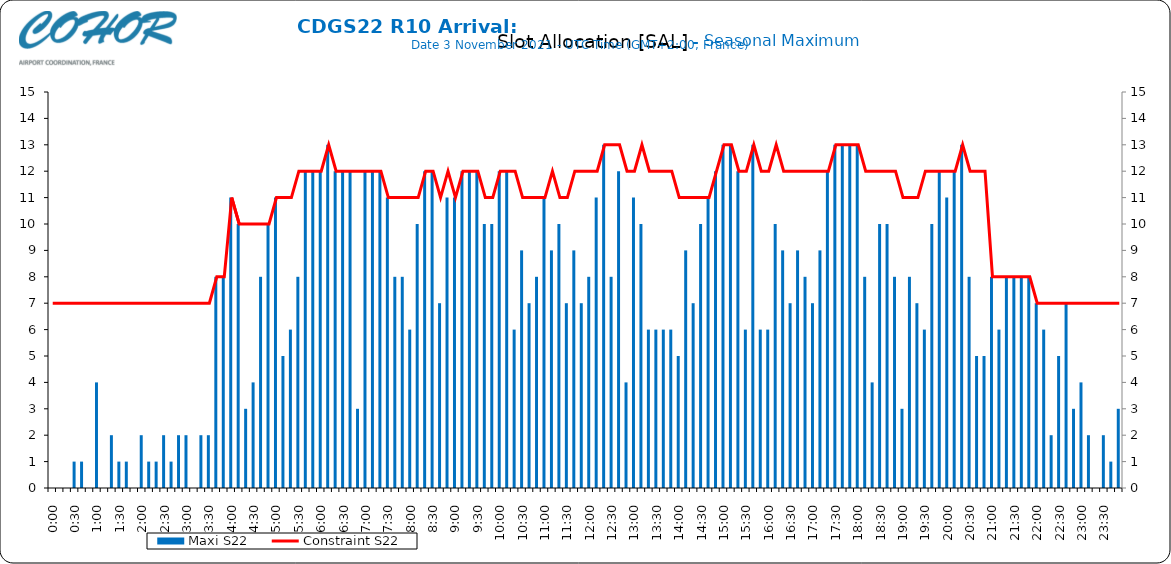
| Category | Maxi S22 |
|---|---|
| 0.0 | 0 |
| 0.006944444444444444 | 0 |
| 0.013888888888888888 | 0 |
| 0.020833333333333332 | 1 |
| 0.027777777777777776 | 1 |
| 0.034722222222222224 | 0 |
| 0.041666666666666664 | 4 |
| 0.04861111111111111 | 0 |
| 0.05555555555555555 | 2 |
| 0.0625 | 1 |
| 0.06944444444444443 | 1 |
| 0.0763888888888889 | 0 |
| 0.08333333333333333 | 2 |
| 0.09027777777777778 | 1 |
| 0.09722222222222222 | 1 |
| 0.10416666666666667 | 2 |
| 0.1111111111111111 | 1 |
| 0.11805555555555557 | 2 |
| 0.125 | 2 |
| 0.13194444444444445 | 0 |
| 0.1388888888888889 | 2 |
| 0.14583333333333334 | 2 |
| 0.15277777777777776 | 8 |
| 0.15972222222222224 | 8 |
| 0.16666666666666666 | 11 |
| 0.17361111111111113 | 10 |
| 0.18055555555555555 | 3 |
| 0.1875 | 4 |
| 0.19444444444444445 | 8 |
| 0.20138888888888887 | 10 |
| 0.20833333333333334 | 11 |
| 0.2152777777777778 | 5 |
| 0.2222222222222222 | 6 |
| 0.22916666666666666 | 8 |
| 0.23611111111111113 | 12 |
| 0.24305555555555555 | 12 |
| 0.25 | 12 |
| 0.2569444444444445 | 13 |
| 0.2638888888888889 | 12 |
| 0.2708333333333333 | 12 |
| 0.2777777777777778 | 12 |
| 0.2847222222222222 | 3 |
| 0.2916666666666667 | 12 |
| 0.2986111111111111 | 12 |
| 0.3055555555555555 | 12 |
| 0.3125 | 11 |
| 0.3194444444444445 | 8 |
| 0.3263888888888889 | 8 |
| 0.3333333333333333 | 6 |
| 0.34027777777777773 | 10 |
| 0.34722222222222227 | 12 |
| 0.3541666666666667 | 12 |
| 0.3611111111111111 | 7 |
| 0.3680555555555556 | 11 |
| 0.375 | 11 |
| 0.3819444444444444 | 12 |
| 0.3888888888888889 | 12 |
| 0.3958333333333333 | 12 |
| 0.40277777777777773 | 10 |
| 0.40972222222222227 | 10 |
| 0.4166666666666667 | 12 |
| 0.4236111111111111 | 12 |
| 0.4305555555555556 | 6 |
| 0.4375 | 9 |
| 0.4444444444444444 | 7 |
| 0.4513888888888889 | 8 |
| 0.4583333333333333 | 11 |
| 0.46527777777777773 | 9 |
| 0.47222222222222227 | 10 |
| 0.4791666666666667 | 7 |
| 0.4861111111111111 | 9 |
| 0.4930555555555556 | 7 |
| 0.5 | 8 |
| 0.5069444444444444 | 11 |
| 0.513888888888889 | 13 |
| 0.5208333333333334 | 8 |
| 0.5277777777777778 | 12 |
| 0.5347222222222222 | 4 |
| 0.5416666666666666 | 11 |
| 0.548611111111111 | 10 |
| 0.5555555555555556 | 6 |
| 0.5625 | 6 |
| 0.5694444444444444 | 6 |
| 0.576388888888889 | 6 |
| 0.5833333333333334 | 5 |
| 0.5902777777777778 | 9 |
| 0.5972222222222222 | 7 |
| 0.6041666666666666 | 10 |
| 0.611111111111111 | 11 |
| 0.6180555555555556 | 12 |
| 0.625 | 13 |
| 0.6319444444444444 | 13 |
| 0.638888888888889 | 12 |
| 0.6458333333333334 | 6 |
| 0.6527777777777778 | 13 |
| 0.6597222222222222 | 6 |
| 0.6666666666666666 | 6 |
| 0.6736111111111112 | 10 |
| 0.6805555555555555 | 9 |
| 0.6875 | 7 |
| 0.6944444444444445 | 9 |
| 0.7013888888888888 | 8 |
| 0.7083333333333334 | 7 |
| 0.7152777777777778 | 9 |
| 0.7222222222222222 | 12 |
| 0.7291666666666666 | 13 |
| 0.7361111111111112 | 13 |
| 0.7430555555555555 | 13 |
| 0.75 | 13 |
| 0.7569444444444445 | 8 |
| 0.7638888888888888 | 4 |
| 0.7708333333333334 | 10 |
| 0.7777777777777778 | 10 |
| 0.7847222222222222 | 8 |
| 0.7916666666666666 | 3 |
| 0.7986111111111112 | 8 |
| 0.8055555555555555 | 7 |
| 0.8125 | 6 |
| 0.8194444444444445 | 10 |
| 0.8263888888888888 | 12 |
| 0.8333333333333334 | 11 |
| 0.8402777777777778 | 12 |
| 0.8472222222222222 | 13 |
| 0.8541666666666666 | 8 |
| 0.8611111111111112 | 5 |
| 0.8680555555555555 | 5 |
| 0.875 | 8 |
| 0.8819444444444445 | 6 |
| 0.8888888888888888 | 8 |
| 0.8958333333333334 | 8 |
| 0.9027777777777778 | 8 |
| 0.9097222222222222 | 8 |
| 0.9166666666666666 | 7 |
| 0.9236111111111112 | 6 |
| 0.9305555555555555 | 2 |
| 0.9375 | 5 |
| 0.9444444444444445 | 7 |
| 0.9513888888888888 | 3 |
| 0.9583333333333334 | 4 |
| 0.9652777777777778 | 2 |
| 0.9722222222222222 | 0 |
| 0.9791666666666666 | 2 |
| 0.9861111111111112 | 1 |
| 0.9930555555555555 | 3 |